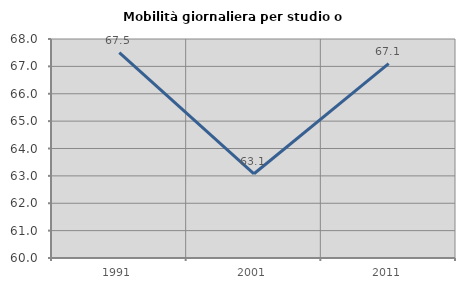
| Category | Mobilità giornaliera per studio o lavoro |
|---|---|
| 1991.0 | 67.5 |
| 2001.0 | 63.076 |
| 2011.0 | 67.098 |